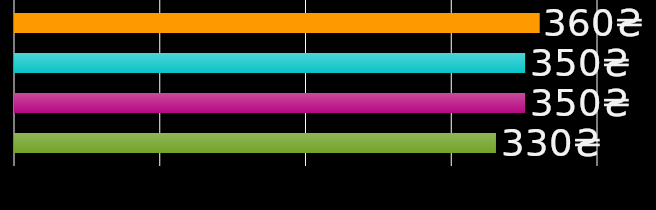
| Category | сусід по кімнаті 1 | сусід по кімнаті 2 | сусід по кімнаті 3 | сусід по кімнаті 4 |
|---|---|---|---|---|
| 0 | 360 | 350 | 350 | 330 |